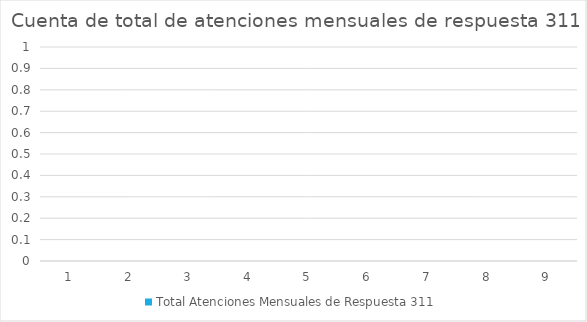
| Category | Total Atenciones Mensuales de Respuesta 311 | Series 1 | Series 2 | Series 3 | Series 4 | Series 5 |
|---|---|---|---|---|---|---|
| 0 | 0 |  |  |  | 0 |  |
| 1 | 0 |  |  |  | 0 |  |
| 2 | 0 |  |  |  | 0 |  |
| 3 | 0 |  |  |  | 0 |  |
| 4 | 0 |  |  |  | 0 |  |
| 5 | 0 |  |  |  | 0 |  |
| 6 | 0 |  |  |  | 0 |  |
| 7 | 0 |  |  |  | 0 |  |
| 8 | 0 |  |  |  | 0 |  |